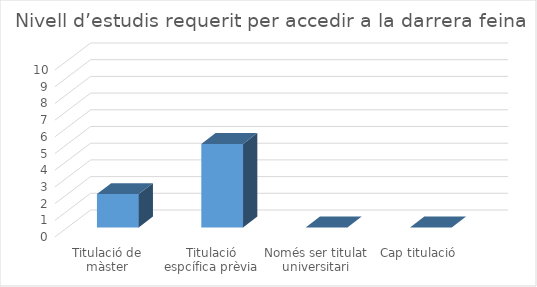
| Category | Series 0 |
|---|---|
| Titulació de màster | 2 |
| Titulació espcífica prèvia | 5 |
| Només ser titulat universitari | 0 |
| Cap titulació | 0 |